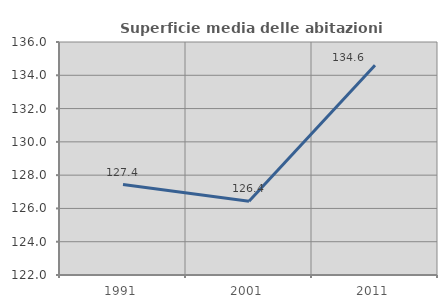
| Category | Superficie media delle abitazioni occupate |
|---|---|
| 1991.0 | 127.434 |
| 2001.0 | 126.431 |
| 2011.0 | 134.606 |